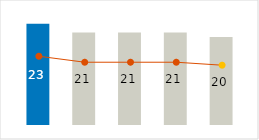
| Category | Power & Fuel |
|---|---|
| 0 | 23 |
| 1 | 21 |
| 2 | 21 |
| 3 | 21 |
| 4 | 20 |